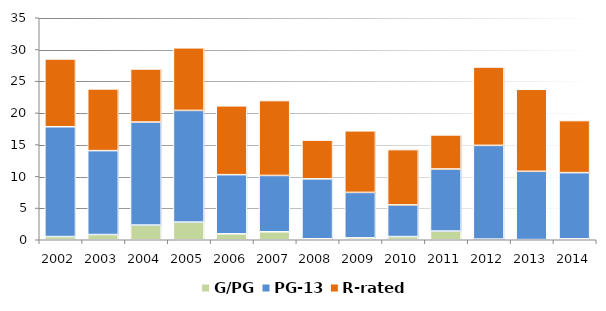
| Category | G/PG | PG-13 | R-rated |
|---|---|---|---|
| 2002.0 | 0.503 | 17.317 | 10.682 |
| 2003.0 | 0.822 | 13.231 | 9.73 |
| 2004.0 | 2.32 | 16.241 | 8.364 |
| 2005.0 | 2.786 | 17.607 | 9.865 |
| 2006.0 | 0.937 | 9.323 | 10.853 |
| 2007.0 | 1.257 | 8.883 | 11.803 |
| 2008.0 | 0.156 | 9.445 | 6.112 |
| 2009.0 | 0.304 | 7.161 | 9.706 |
| 2010.0 | 0.5 | 4.997 | 8.715 |
| 2011.0 | 1.374 | 9.784 | 5.372 |
| 2012.0 | 0.106 | 14.777 | 12.352 |
| 2013.0 | 0.025 | 10.768 | 12.925 |
| 2014.0 | 0.151 | 10.431 | 8.211 |